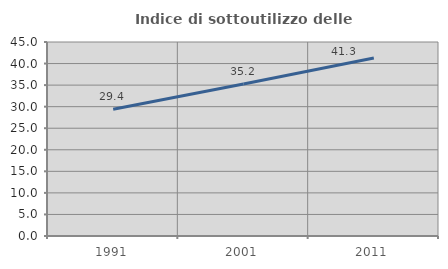
| Category | Indice di sottoutilizzo delle abitazioni  |
|---|---|
| 1991.0 | 29.407 |
| 2001.0 | 35.243 |
| 2011.0 | 41.285 |